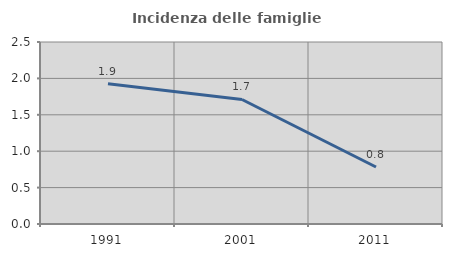
| Category | Incidenza delle famiglie numerose |
|---|---|
| 1991.0 | 1.925 |
| 2001.0 | 1.71 |
| 2011.0 | 0.783 |